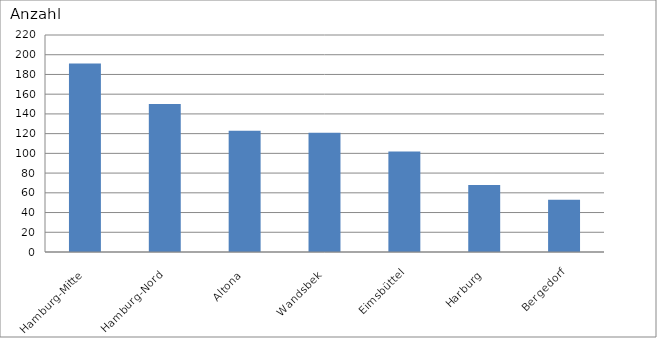
| Category | Hamburg-Mitte Hamburg-Nord Altona Wandsbek Eimsbüttel Harburg Bergedorf |
|---|---|
| Hamburg-Mitte | 191 |
| Hamburg-Nord | 150 |
| Altona | 123 |
| Wandsbek | 121 |
| Eimsbüttel | 102 |
| Harburg | 68 |
| Bergedorf | 53 |